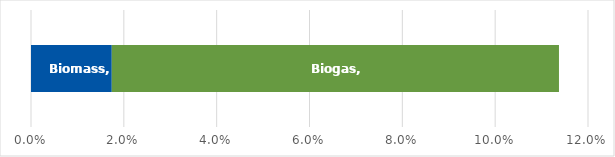
| Category | Biomass | Biogas |
|---|---|---|
| 0 | 0.017 | 0.096 |